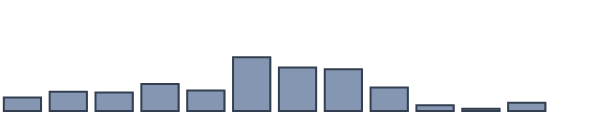
| Category | Series 0 |
|---|---|
| 0 | 4.848 |
| 1 | 6.97 |
| 2 | 6.667 |
| 3 | 9.697 |
| 4 | 7.348 |
| 5 | 19.394 |
| 6 | 15.682 |
| 7 | 15.076 |
| 8 | 8.485 |
| 9 | 2.045 |
| 10 | 0.833 |
| 11 | 2.955 |
| 12 | 0 |